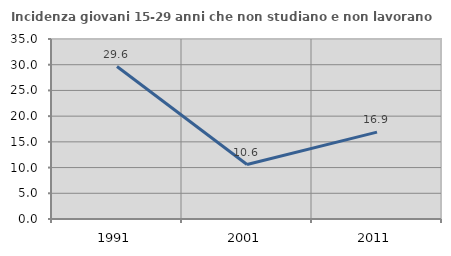
| Category | Incidenza giovani 15-29 anni che non studiano e non lavorano  |
|---|---|
| 1991.0 | 29.648 |
| 2001.0 | 10.597 |
| 2011.0 | 16.887 |